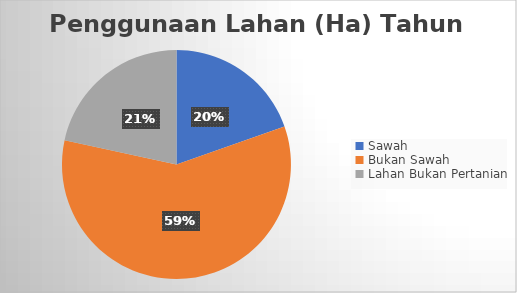
| Category | Series 0 |
|---|---|
| Sawah | 16901 |
| Bukan Sawah | 50658 |
| Lahan Bukan Pertanian | 18623 |